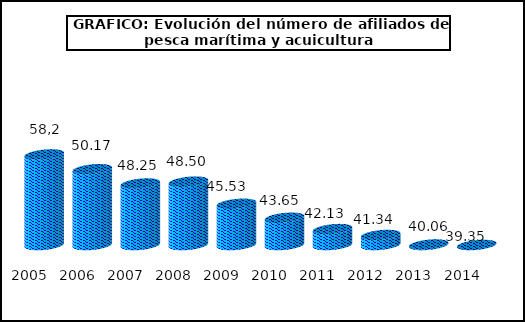
| Category | Series 0 |
|---|---|
| 2005.0 | 52.15 |
| 2006.0 | 50.17 |
| 2007.0 | 48.25 |
| 2008.0 | 48.5 |
| 2009.0 | 45.53 |
| 2010.0 | 43.65 |
| 2011.0 | 42.13 |
| 2012.0 | 41.34 |
| 2013.0 | 40.06 |
| 2014.0 | 39.35 |